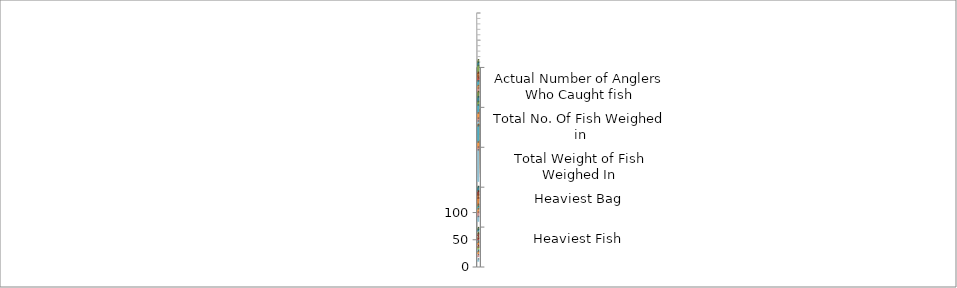
| Category | Series 0 | Series 2 | Series 4 | Series 6 | Series 8 | Series 1 | Series 3 | Series 5 | Series 7 | Series 9 | Series 10 | Series 11 | Series 12 | Series 13 | Series 14 | Series 15 | Series 16 | Series 17 | Series 18 | Series 19 | Series 20 | Series 21 | Series 22 | Series 23 | Series 24 |
|---|---|---|---|---|---|---|---|---|---|---|---|---|---|---|---|---|---|---|---|---|---|---|---|---|---|
| Actual Number of Anglers Who Caught fish |  | 18 | 16 |  | 16 | 6 |  | 10 | 7 |  | 9 | 15 |  | 18 | 15 |  | 21 | 15 |  | 16 |  |  | 16 |  |  |
| Total No. Of Fish Weighed in |  | 33 | 26 |  | 23 | 10 |  | 15 | 9 |  | 10 | 34 |  | 33 | 23 |  | 50 | 38 |  | 34 |  |  | 37 |  |  |
| Total Weight of Fish Weighed In |  | 45.404 | 46.695 |  | 36.075 | 19.096 |  | 27.869 | 15.692 |  | 17.559 | 73.553 |  | 49.644 | 31.272 |  | 85.008 | 57.925 |  | 54.186 |  |  | 57.493 |  |  |
| Heaviest Bag |  | 5.203 | 7.239 |  | 5.094 | 7.672 |  | 6.584 | 4.189 |  | 3.167 | 11.41 |  | 5.64 | 7.108 |  | 9.996 | 8.681 |  | 8.021 |  |  | 8.102 |  |  |
| Heaviest Fish |  | 2.985 | 2.921 |  | 2.504 | 2.504 |  | 2.87 | 2.92 |  | 3.167 | 4.031 |  | 3.42 | 3.331 |  | 2.906 | 3.291 |  | 3.11 |  |  | 3.578 |  |  |